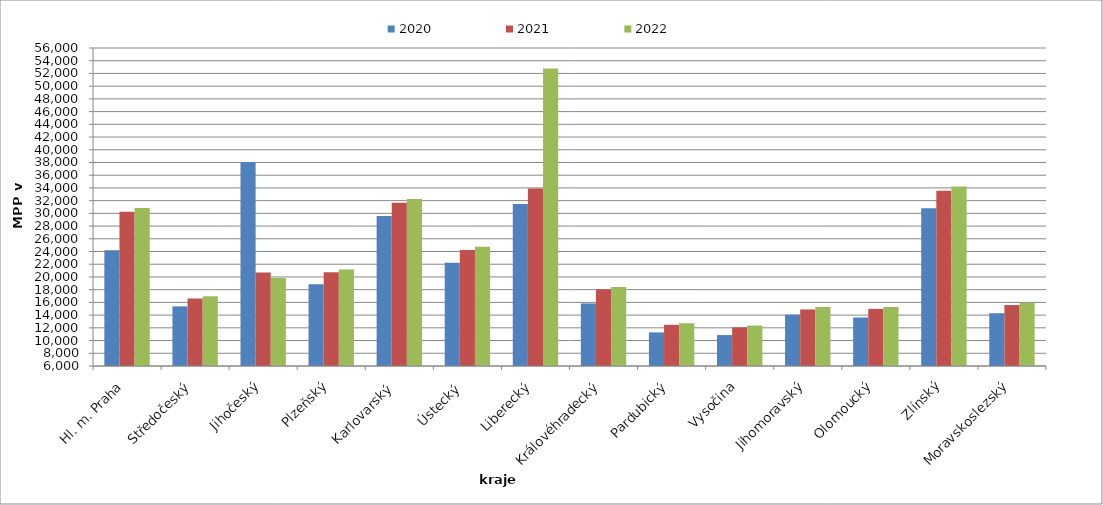
| Category | 2020 | 2021 | 2022 |
|---|---|---|---|
| Hl. m. Praha | 24205.518 | 30242.815 | 30826.979 |
| Středočeský | 15372.288 | 16622.476 | 16955.048 |
| Jihočeský | 38065.64 | 20697.928 | 19837.064 |
| Plzeňský | 18870.568 | 20757.726 | 21173.053 |
| Karlovarský  | 29600 | 31680 | 32240 |
| Ústecký   | 22244.735 | 24246.557 | 24737.106 |
| Liberecký | 31466.21 | 33892.187 | 52778.71 |
| Královéhradecký | 15843.98 | 18062.725 | 18423.937 |
| Pardubický | 11281.241 | 12473.925 | 12723.606 |
| Vysočina | 10860.759 | 12079.804 | 12357.534 |
| Jihomoravský | 14071.496 | 14892.944 | 15274.13 |
| Olomoucký | 13624.03 | 14986.322 | 15286.137 |
| Zlínský | 30785.101 | 33570.006 | 34241.406 |
| Moravskoslezský | 14300.383 | 15583.751 | 15913.76 |